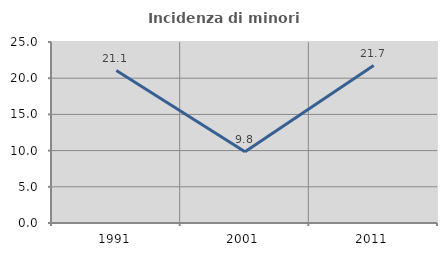
| Category | Incidenza di minori stranieri |
|---|---|
| 1991.0 | 21.053 |
| 2001.0 | 9.836 |
| 2011.0 | 21.739 |